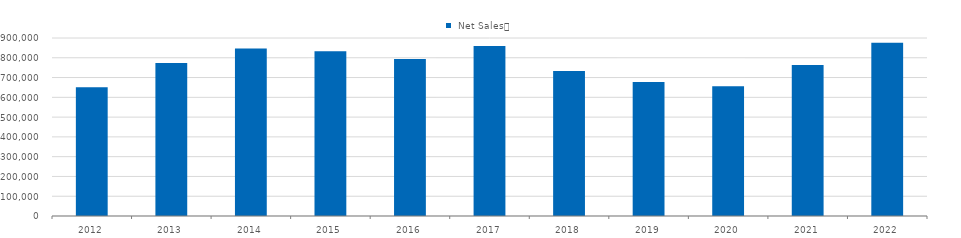
| Category |  Net Sales　 |
|---|---|
| 2012.0 | 650461 |
| 2013.0 | 772966 |
| 2014.0 | 847252 |
| 2015.0 | 833604 |
| 2016.0 | 794201 |
| 2017.0 | 859982 |
| 2018.0 | 732581 |
| 2019.0 | 677980 |
| 2020.0 | 655529 |
| 2021.0 | 762927 |
| 2022.0 | 876082 |